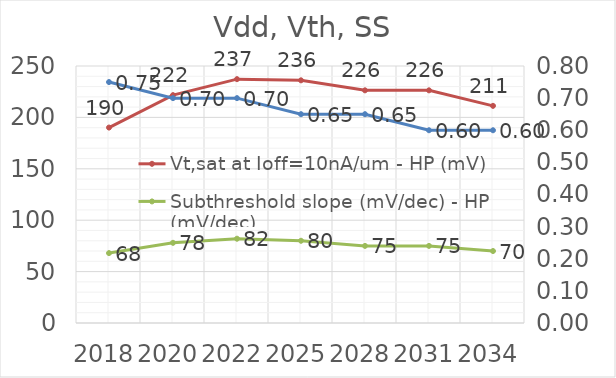
| Category | Vt,sat at Ioff=10nA/um - HP (mV) | Subthreshold slope (mV/dec) - HP (mV/dec) |
|---|---|---|
| 2018.0 | 190.12 | 68 |
| 2020.0 | 221.648 | 78 |
| 2022.0 | 237.209 | 82 |
| 2025.0 | 236.063 | 80 |
| 2028.0 | 226.33 | 75 |
| 2031.0 | 226.33 | 75 |
| 2034.0 | 211.241 | 70 |